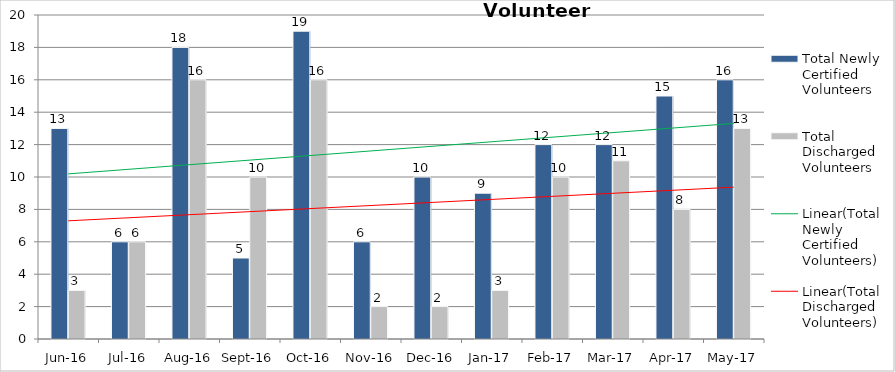
| Category | Total Newly Certified Volunteers | Total Discharged Volunteers |
|---|---|---|
| Jun-16 | 13 | 3 |
| Jul-16 | 6 | 6 |
| Aug-16 | 18 | 16 |
| Sep-16 | 5 | 10 |
| Oct-16 | 19 | 16 |
| Nov-16 | 6 | 2 |
| Dec-16 | 10 | 2 |
| Jan-17 | 9 | 3 |
| Feb-17 | 12 | 10 |
| Mar-17 | 12 | 11 |
| Apr-17 | 15 | 8 |
| May-17 | 16 | 13 |